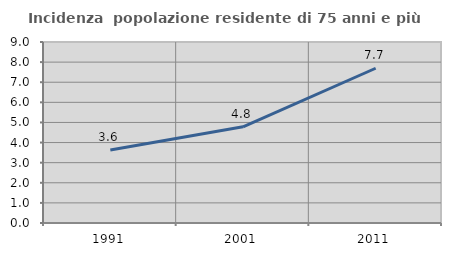
| Category | Incidenza  popolazione residente di 75 anni e più |
|---|---|
| 1991.0 | 3.633 |
| 2001.0 | 4.781 |
| 2011.0 | 7.695 |